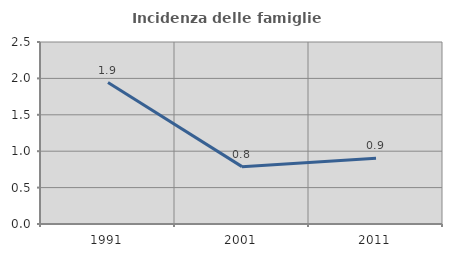
| Category | Incidenza delle famiglie numerose |
|---|---|
| 1991.0 | 1.943 |
| 2001.0 | 0.788 |
| 2011.0 | 0.902 |